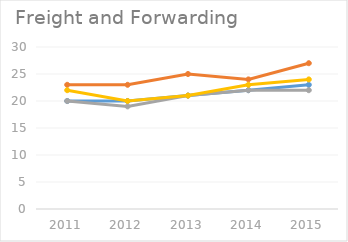
| Category | ACC Ltd | Ambuja Cement | JK Lakshmi Cement | Ultratech Cement |
|---|---|---|---|---|
| 2011 | 20 | 23 | 20 | 22 |
| 2012 | 20 | 23 | 19 | 20 |
| 2013 | 21 | 25 | 21 | 21 |
| 2014 | 22 | 24 | 22 | 23 |
| 2015 | 23 | 27 | 22 | 24 |